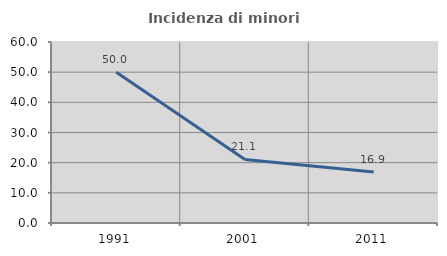
| Category | Incidenza di minori stranieri |
|---|---|
| 1991.0 | 50 |
| 2001.0 | 21.053 |
| 2011.0 | 16.883 |